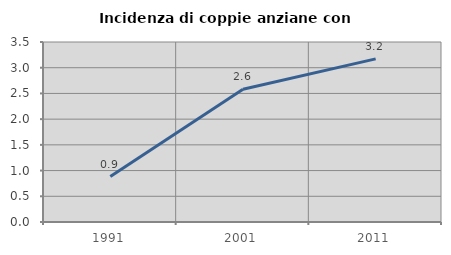
| Category | Incidenza di coppie anziane con figli |
|---|---|
| 1991.0 | 0.884 |
| 2001.0 | 2.581 |
| 2011.0 | 3.171 |